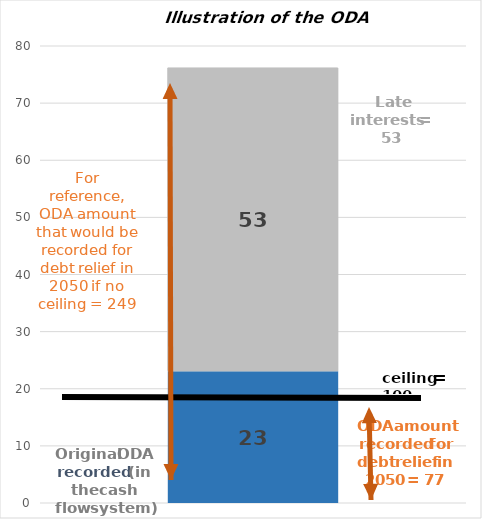
| Category | Series 2 | Series 1 | Series 0 |
|---|---|---|---|
| 0 | 23.077 | 0 | 53.082 |